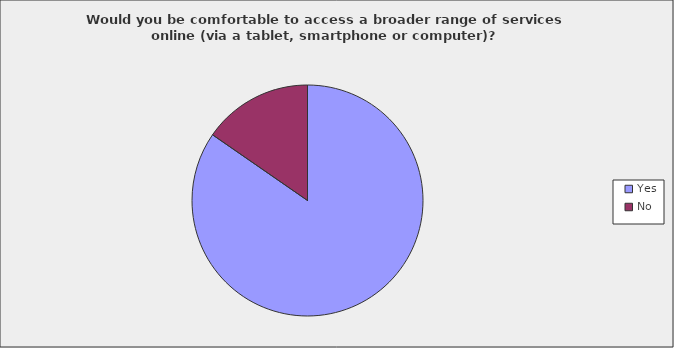
| Category | Series 0 |
|---|---|
| Yes | 0.846 |
| No | 0.154 |